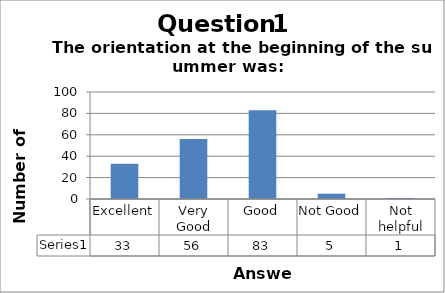
| Category | Series 0 |
|---|---|
| Excellent | 33 |
| Very Good | 56 |
| Good | 83 |
| Not Good | 5 |
| Not helpful | 1 |